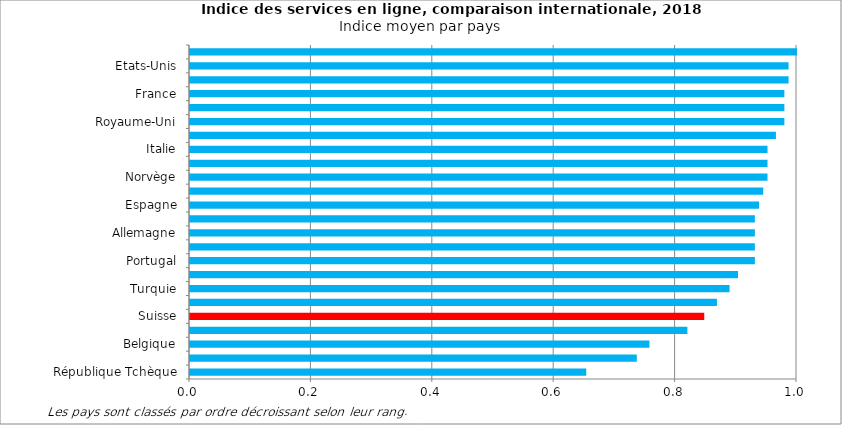
| Category | Indice moyen |
|---|---|
| République Tchèque | 0.653 |
| Slovaquie | 0.736 |
| Belgique | 0.757 |
| Grèce | 0.819 |
| Suisse | 0.847 |
| Autriche | 0.868 |
| Turquie | 0.889 |
| Estonie | 0.903 |
| Portugal | 0.931 |
| Pays-Bas | 0.931 |
| Allemagne | 0.931 |
| Canada | 0.931 |
| Espagne | 0.938 |
| Suède | 0.944 |
| Norvège | 0.951 |
| Japon | 0.951 |
| Italie | 0.951 |
| Finlande | 0.965 |
| Royaume-Uni | 0.979 |
| Corée du sud | 0.979 |
| France | 0.979 |
| Singapour | 0.986 |
| Etats-Unis | 0.986 |
| Danemark | 1 |